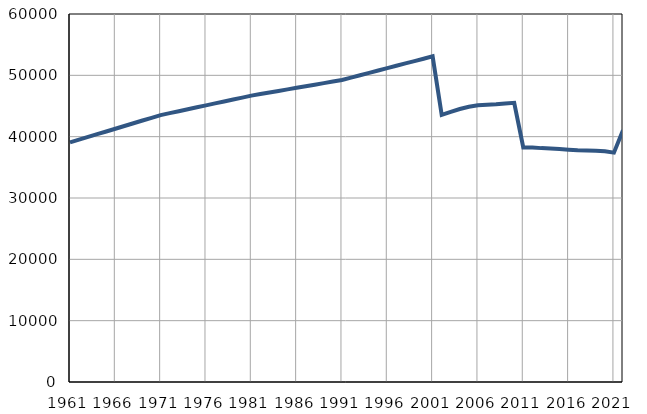
| Category | Број
становника |
|---|---|
| 1961.0 | 39064 |
| 1962.0 | 39510 |
| 1963.0 | 39956 |
| 1964.0 | 40401 |
| 1965.0 | 40847 |
| 1966.0 | 41293 |
| 1967.0 | 41739 |
| 1968.0 | 42185 |
| 1969.0 | 42630 |
| 1970.0 | 43076 |
| 1971.0 | 43522 |
| 1972.0 | 43839 |
| 1973.0 | 44155 |
| 1974.0 | 44472 |
| 1975.0 | 44789 |
| 1976.0 | 45105 |
| 1977.0 | 45422 |
| 1978.0 | 45739 |
| 1979.0 | 46056 |
| 1980.0 | 46372 |
| 1981.0 | 46689 |
| 1982.0 | 46944 |
| 1983.0 | 47199 |
| 1984.0 | 47454 |
| 1985.0 | 47709 |
| 1986.0 | 47963 |
| 1987.0 | 48218 |
| 1988.0 | 48472 |
| 1989.0 | 48728 |
| 1990.0 | 48983 |
| 1991.0 | 49238 |
| 1992.0 | 49624 |
| 1993.0 | 50010 |
| 1994.0 | 50396 |
| 1995.0 | 50782 |
| 1996.0 | 51168 |
| 1997.0 | 51555 |
| 1998.0 | 51941 |
| 1999.0 | 52327 |
| 2000.0 | 52713 |
| 2001.0 | 53099 |
| 2002.0 | 43551 |
| 2003.0 | 44045 |
| 2004.0 | 44506 |
| 2005.0 | 44865 |
| 2006.0 | 45107 |
| 2007.0 | 45212 |
| 2008.0 | 45279 |
| 2009.0 | 45396 |
| 2010.0 | 45509 |
| 2011.0 | 38230 |
| 2012.0 | 38214 |
| 2013.0 | 38132 |
| 2014.0 | 38085 |
| 2015.0 | 37997 |
| 2016.0 | 37867 |
| 2017.0 | 37769 |
| 2018.0 | 37735 |
| 2019.0 | 37718 |
| 2020.0 | 37615 |
| 2021.0 | 37394 |
| 2022.0 | 41056 |